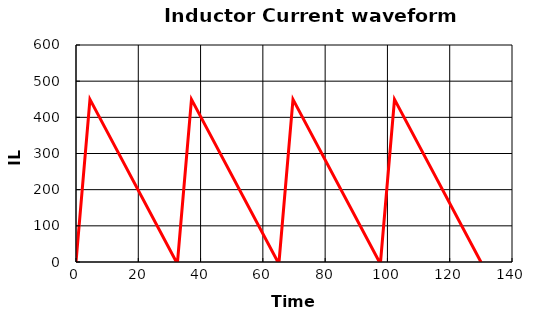
| Category | IL |
|---|---|
| 0.0 | 0 |
| 4.48291378622435 | 449.549 |
| 32.23282211668149 | 0 |
| 32.59578504787297 | 0 |
| 37.078698834097324 | 449.549 |
| 64.82860716455446 | 0 |
| 65.19157009574594 | 0 |
| 69.67448388197029 | 449.549 |
| 97.42439221242743 | 0 |
| 97.78735514361891 | 0 |
| 102.27026892984325 | 449.549 |
| 130.0201772603004 | 0 |
| 130.38314019149186 | 0 |